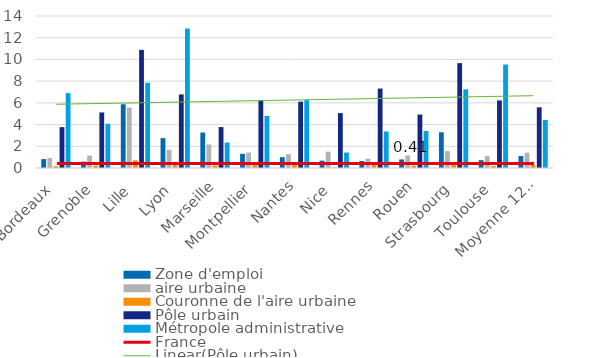
| Category | Zone d'emploi | aire urbaine | Couronne de l'aire urbaine | Pôle urbain | Métropole administrative |
|---|---|---|---|---|---|
| Bordeaux | 0.817 | 0.915 | 0.166 | 3.763 | 6.898 |
| Grenoble | 0.583 | 1.15 | 0.222 | 5.119 | 4.075 |
| Lille | 5.873 | 5.569 | 0.715 | 10.88 | 7.854 |
| Lyon | 2.755 | 1.682 | 0.428 | 6.781 | 12.841 |
| Marseille | 3.267 | 2.164 | 0.234 | 3.77 | 2.344 |
| Montpellier | 1.303 | 1.422 | 0.303 | 6.247 | 4.793 |
| Nantes | 1 | 1.274 | 0.304 | 6.112 | 6.249 |
| Nice | 0.678 | 1.507 | 0.067 | 5.056 | 1.424 |
| Rennes | 0.643 | 0.856 | 0.315 | 7.318 | 3.365 |
| Rouen | 0.793 | 1.158 | 0.224 | 4.923 | 3.405 |
| Strasbourg | 3.29 | 1.556 | 0.552 | 9.661 | 7.245 |
| Toulouse | 0.722 | 1.093 | 0.182 | 6.226 | 9.53 |
| Moyenne 12 métropoles | 1.099 | 1.415 | 0.281 | 5.59 | 4.429 |